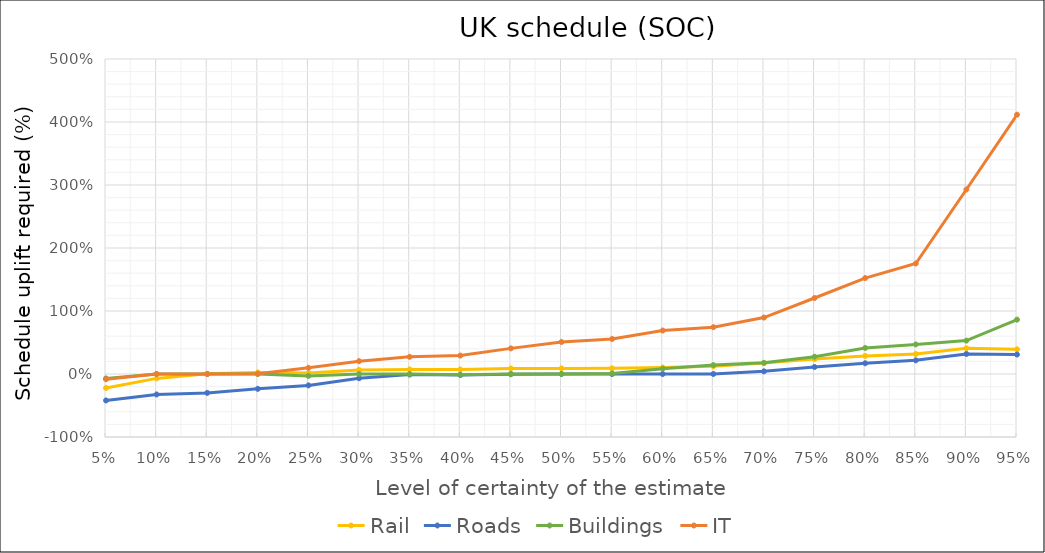
| Category | Rail | Roads | Buildings | IT |
|---|---|---|---|---|
| 0.05 | -0.221 | -0.42 | -0.07 | -0.082 |
| 0.1 | -0.07 | -0.325 | 0 | 0 |
| 0.15 | 0.003 | -0.3 | 0 | 0 |
| 0.2 | 0.025 | -0.235 | 0 | 0.005 |
| 0.25 | 0.016 | -0.181 | -0.03 | 0.099 |
| 0.3 | 0.064 | -0.066 | 0 | 0.204 |
| 0.35 | 0.073 | -0.009 | 0 | 0.273 |
| 0.4 | 0.072 | -0.016 | -0.01 | 0.293 |
| 0.45 | 0.088 | -0.003 | 0 | 0.407 |
| 0.5 | 0.089 | 0 | 0.001 | 0.508 |
| 0.55 | 0.09 | 0 | 0.01 | 0.556 |
| 0.6 | 0.102 | 0 | 0.085 | 0.69 |
| 0.65 | 0.123 | 0 | 0.141 | 0.743 |
| 0.7 | 0.174 | 0.043 | 0.177 | 0.896 |
| 0.75 | 0.237 | 0.112 | 0.275 | 1.206 |
| 0.8 | 0.288 | 0.17 | 0.413 | 1.523 |
| 0.85 | 0.318 | 0.217 | 0.469 | 1.754 |
| 0.9 | 0.408 | 0.318 | 0.53 | 2.928 |
| 0.95 | 0.392 | 0.309 | 0.862 | 4.115 |